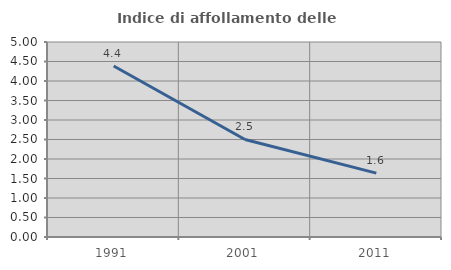
| Category | Indice di affollamento delle abitazioni  |
|---|---|
| 1991.0 | 4.384 |
| 2001.0 | 2.502 |
| 2011.0 | 1.639 |